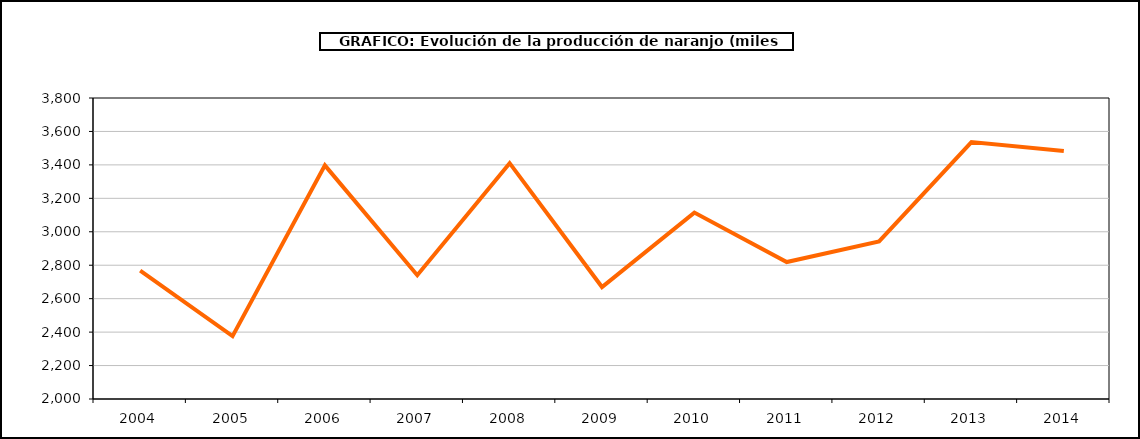
| Category | producción |
|---|---|
| 2004.0 | 2767.148 |
| 2005.0 | 2376.23 |
| 2006.0 | 3397.011 |
| 2007.0 | 2740.28 |
| 2008.0 | 3410.288 |
| 2009.0 | 2669.355 |
| 2010.0 | 3114.808 |
| 2011.0 | 2818.888 |
| 2012.0 | 2942.28 |
| 2013.0 | 3536.745 |
| 2014.0 | 3483.503 |